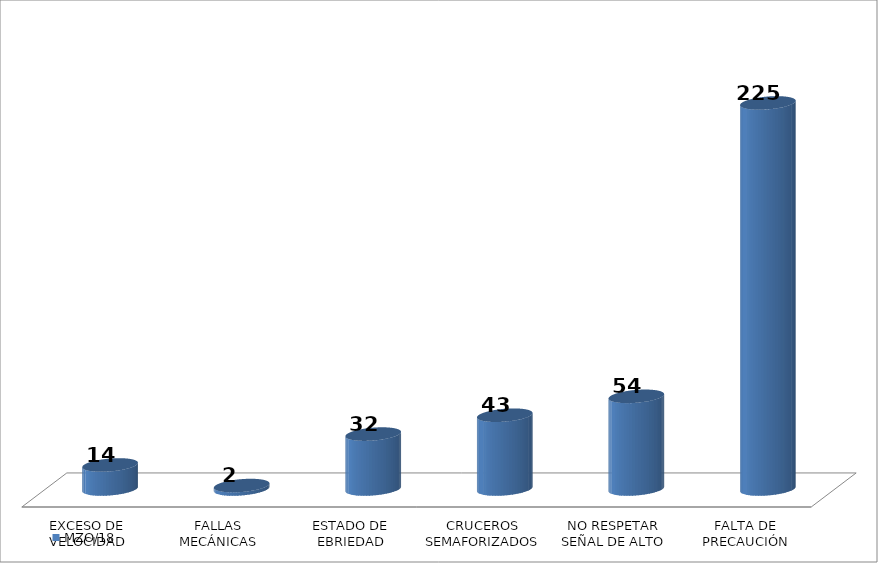
| Category | MZO/18 |
|---|---|
| EXCESO DE VELOCIDAD | 14 |
| FALLAS MECÁNICAS | 2 |
| ESTADO DE EBRIEDAD | 32 |
| CRUCEROS SEMAFORIZADOS | 43 |
| NO RESPETAR SEÑAL DE ALTO | 54 |
| FALTA DE PRECAUCIÓN | 225 |